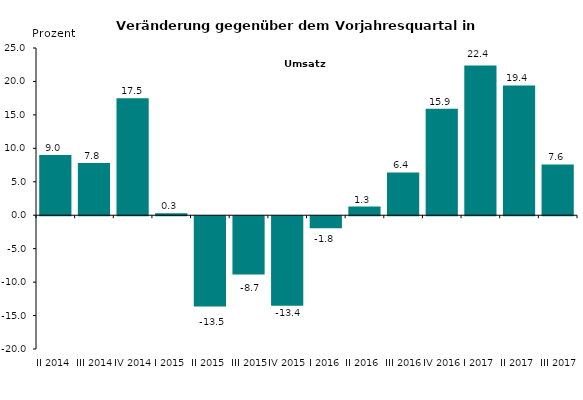
| Category | 9,0 7,8 17,5 0,3 -13,5 -8,7 -13,4 -1,8 1,3 6,4 15,9 22,4 19,4 7,6 |
|---|---|
| II 2014 | 9 |
| III 2014 | 7.8 |
| IV 2014 | 17.5 |
| I 2015 | 0.3 |
| II 2015 | -13.5 |
| III 2015 | -8.7 |
| IV 2015 | -13.4 |
| I 2016 | -1.8 |
| II 2016 | 1.3 |
| III 2016 | 6.4 |
| IV 2016 | 15.9 |
| I 2017 | 22.4 |
| II 2017 | 19.4 |
| III 2017 | 7.6 |